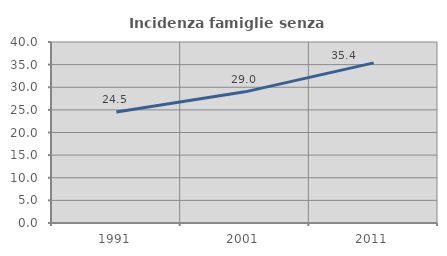
| Category | Incidenza famiglie senza nuclei |
|---|---|
| 1991.0 | 24.546 |
| 2001.0 | 28.984 |
| 2011.0 | 35.393 |